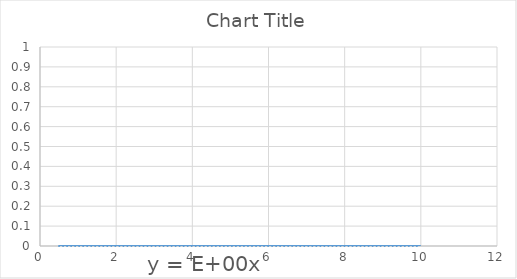
| Category | Series 0 |
|---|---|
| 10.0 | 0 |
| 2.0 | 0 |
| 1.0 | 0 |
| 0.5 | 0 |